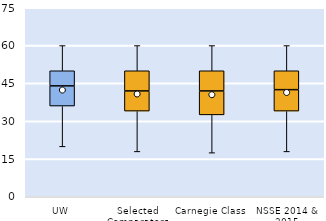
| Category | 25th | 50th | 75th |
|---|---|---|---|
| UW | 36 | 8 | 6 |
| Selected Comparators | 34 | 8 | 8 |
| Carnegie Class | 32.5 | 9.5 | 8 |
| NSSE 2014 & 2015 | 34 | 8.5 | 7.5 |